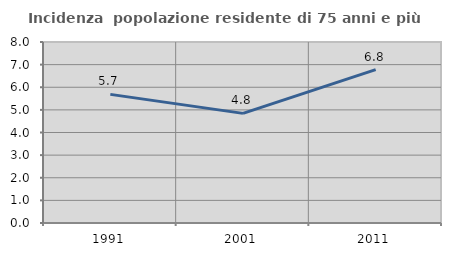
| Category | Incidenza  popolazione residente di 75 anni e più |
|---|---|
| 1991.0 | 5.686 |
| 2001.0 | 4.846 |
| 2011.0 | 6.779 |